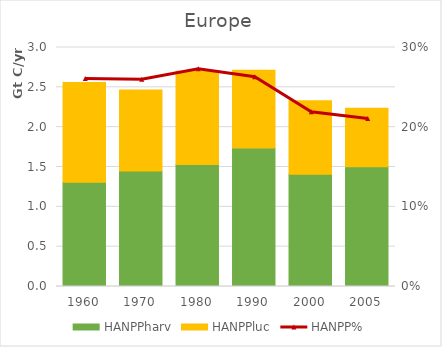
| Category | HANPPharv | HANPPluc |
|---|---|---|
| 1960.0 | 1307061.602 | 1252884.466 |
| 1970.0 | 1449035.346 | 1018252.428 |
| 1980.0 | 1531571.723 | 1171226.039 |
| 1990.0 | 1738327.958 | 974748.448 |
| 2000.0 | 1408078.157 | 922034.934 |
| 2005.0 | 1504344.653 | 732846.503 |